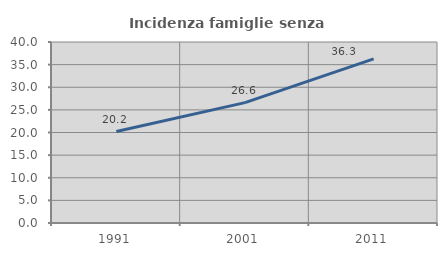
| Category | Incidenza famiglie senza nuclei |
|---|---|
| 1991.0 | 20.22 |
| 2001.0 | 26.61 |
| 2011.0 | 36.281 |